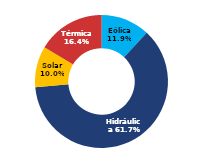
| Category | Sur |
|---|---|
| Eólica | 68.17 |
| Hidráulica | 352.929 |
| Solar | 57.131 |
| Térmica | 93.743 |